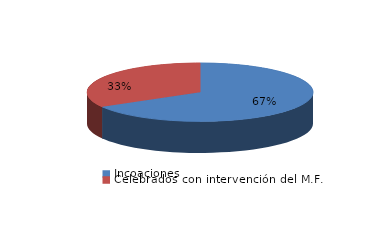
| Category | Series 0 |
|---|---|
| Incoaciones | 7594 |
| Celebrados con intervención del M.F. | 3807 |